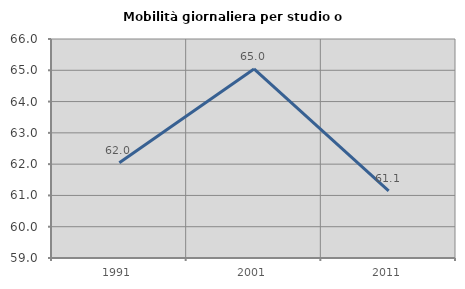
| Category | Mobilità giornaliera per studio o lavoro |
|---|---|
| 1991.0 | 62.043 |
| 2001.0 | 65.042 |
| 2011.0 | 61.147 |